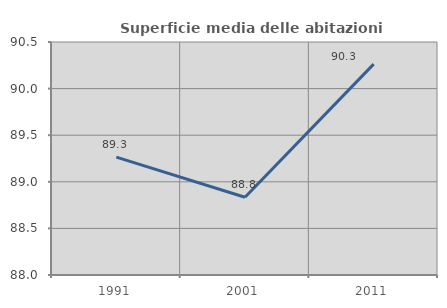
| Category | Superficie media delle abitazioni occupate |
|---|---|
| 1991.0 | 89.264 |
| 2001.0 | 88.834 |
| 2011.0 | 90.263 |